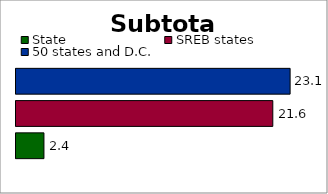
| Category | State | SREB states | 50 states and D.C. |
|---|---|---|---|
| 0 | 2.353 | 21.617 | 23.074 |